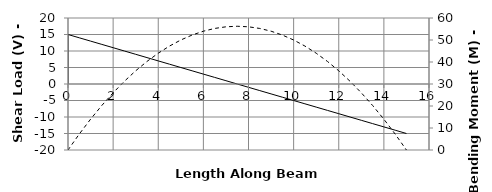
| Category | V |
|---|---|
| 0.0 | 0 |
| 0.0 | 15 |
| 0.5 | 14 |
| 1.0 | 13 |
| 1.5 | 12 |
| 2.0 | 11 |
| 2.00001 | 11 |
| 2.5 | 10 |
| 3.0 | 9 |
| 3.5 | 8 |
| 4.0 | 7 |
| 4.5 | 6 |
| 5.0 | 5 |
| 5.5 | 4 |
| 6.0 | 3 |
| 6.5 | 2 |
| 7.0 | 1 |
| 7.5 | 0 |
| 8.0 | -1 |
| 8.5 | -2 |
| 9.0 | -3 |
| 9.5 | -4 |
| 10.0 | -5 |
| 10.5 | -6 |
| 11.0 | -7 |
| 11.5 | -8 |
| 12.0 | -9 |
| 12.5 | -10 |
| 13.0 | -11 |
| 13.5 | -12 |
| 14.0 | -13 |
| 14.5 | -14 |
| 15.0 | -15 |
| 15.0 | -15 |